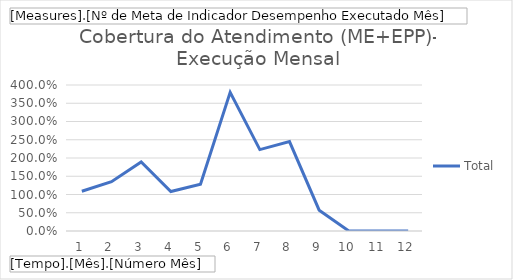
| Category | Total |
|---|---|
| 1 | 1.09 |
| 2 | 1.35 |
| 3 | 1.89 |
| 4 | 1.08 |
| 5 | 1.28 |
| 6 | 3.8 |
| 7 | 2.23 |
| 8 | 2.45 |
| 9 | 0.57 |
| 10 | 0 |
| 11 | 0 |
| 12 | 0 |